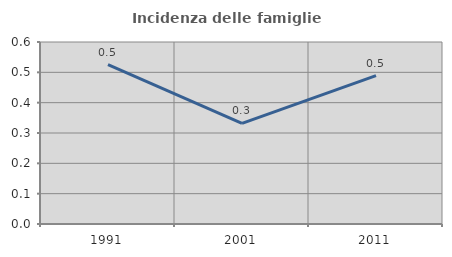
| Category | Incidenza delle famiglie numerose |
|---|---|
| 1991.0 | 0.525 |
| 2001.0 | 0.332 |
| 2011.0 | 0.489 |